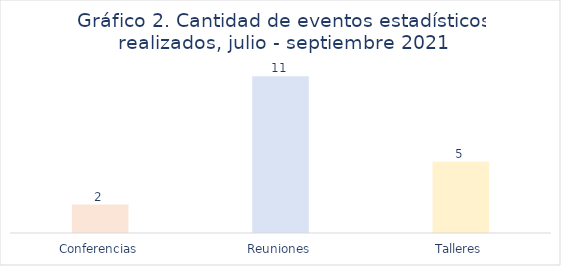
| Category | Series 0 |
|---|---|
| Conferencias | 2 |
| Reuniones | 11 |
| Talleres | 5 |